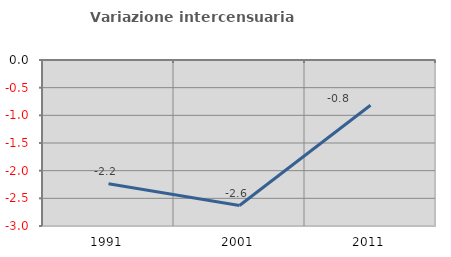
| Category | Variazione intercensuaria annua |
|---|---|
| 1991.0 | -2.236 |
| 2001.0 | -2.63 |
| 2011.0 | -0.817 |